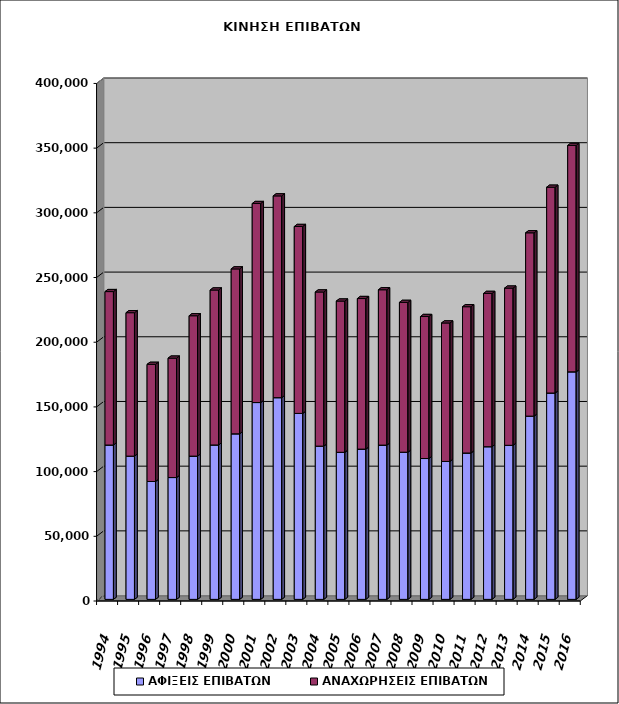
| Category | ΑΦΙΞΕΙΣ ΕΠΙΒΑΤΩΝ | ΑΝΑΧΩΡΗΣΕΙΣ ΕΠΙΒΑΤΩΝ |
|---|---|---|
| 1994.0 | 119301 | 118568 |
| 1995.0 | 110706 | 110849 |
| 1996.0 | 91119 | 90508 |
| 1997.0 | 94156 | 92276 |
| 1998.0 | 110723 | 108481 |
| 1999.0 | 119351 | 119745 |
| 2000.0 | 127962 | 127432 |
| 2001.0 | 152115 | 153813 |
| 2002.0 | 155897 | 155938 |
| 2003.0 | 143717 | 144456 |
| 2004.0 | 118431 | 119132 |
| 2005.0 | 113659 | 116890 |
| 2006.0 | 116136 | 116357 |
| 2007.0 | 119229 | 120058 |
| 2008.0 | 113740 | 115771 |
| 2009.0 | 108855 | 109746 |
| 2010.0 | 106619 | 106990 |
| 2011.0 | 113125 | 113060 |
| 2012.0 | 117989 | 118451 |
| 2013.0 | 119070 | 121487 |
| 2014.0 | 141609 | 141691 |
| 2015.0 | 159492 | 159031 |
| 2016.0 | 175866 | 174961 |